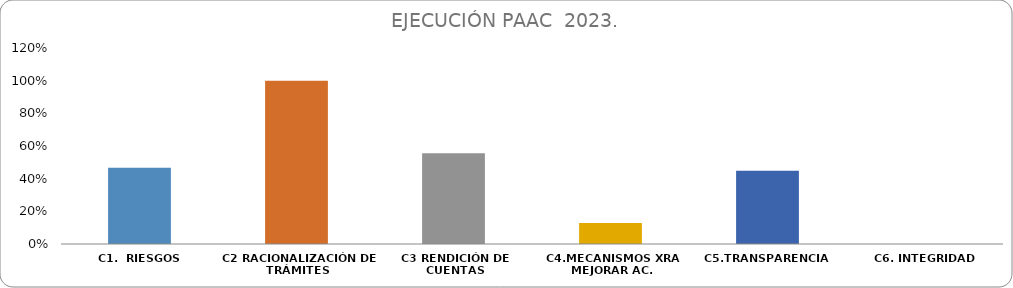
| Category | % CUMPLIMIENTO  |
|---|---|
| C1.  RIESGOS | 0.467 |
| C2 RACIONALIZACIÓN DE TRÁMITES | 1 |
| C3 RENDICIÓN DE CUENTAS | 0.556 |
| C4.MECANISMOS XRA MEJORAR AC. | 0.129 |
| C5.TRANSPARENCIA  | 0.448 |
| C6. INTEGRIDAD | 0 |